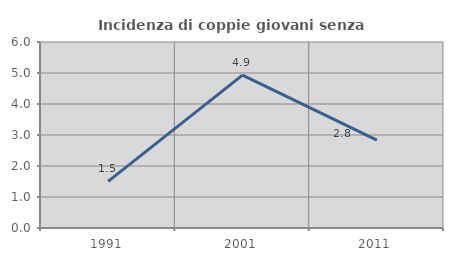
| Category | Incidenza di coppie giovani senza figli |
|---|---|
| 1991.0 | 1.504 |
| 2001.0 | 4.93 |
| 2011.0 | 2.837 |